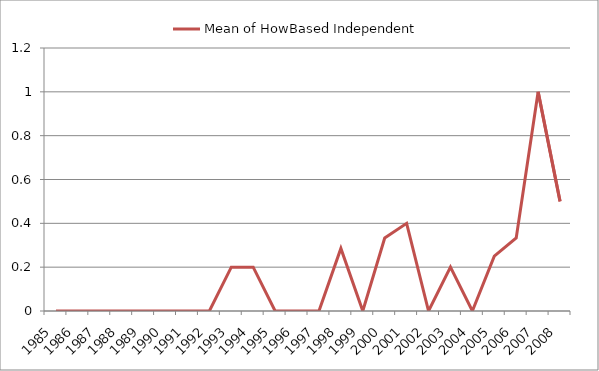
| Category | Mean of HowBased Independent |
|---|---|
| 1985.0 | 0 |
| 1986.0 | 0 |
| 1987.0 | 0 |
| 1988.0 | 0 |
| 1989.0 | 0 |
| 1990.0 | 0 |
| 1991.0 | 0 |
| 1992.0 | 0 |
| 1993.0 | 0.2 |
| 1994.0 | 0.2 |
| 1995.0 | 0 |
| 1996.0 | 0 |
| 1997.0 | 0 |
| 1998.0 | 0.286 |
| 1999.0 | 0 |
| 2000.0 | 0.333 |
| 2001.0 | 0.4 |
| 2002.0 | 0 |
| 2003.0 | 0.2 |
| 2004.0 | 0 |
| 2005.0 | 0.25 |
| 2006.0 | 0.333 |
| 2007.0 | 1 |
| 2008.0 | 0.5 |